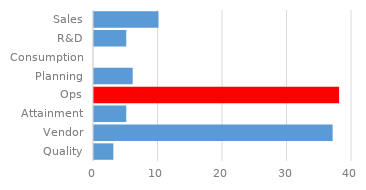
| Category | Series 0 |
|---|---|
| Quality | 3 |
| Vendor | 37 |
| Attainment | 5 |
| Ops | 38 |
| Planning | 6 |
| Consumption | 0 |
| R&D | 5 |
| Sales | 10 |